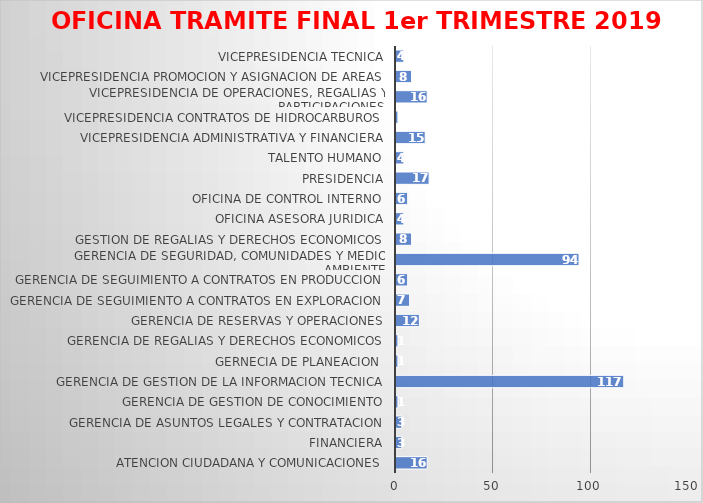
| Category | Series 0 |
|---|---|
| ATENCION CIUDADANA Y COMUNICACIONES | 16 |
| FINANCIERA | 3 |
| GERENCIA DE ASUNTOS LEGALES Y CONTRATACION | 3 |
| GERENCIA DE GESTION DE CONOCIMIENTO | 1 |
| GERENCIA DE GESTION DE LA INFORMACION TECNICA | 117 |
| GERNECIA DE PLANEACION  | 1 |
| GERENCIA DE REGALIAS Y DERECHOS ECONOMICOS | 1 |
| GERENCIA DE RESERVAS Y OPERACIONES | 12 |
| GERENCIA DE SEGUIMIENTO A CONTRATOS EN EXPLORACION | 7 |
| GERENCIA DE SEGUIMIENTO A CONTRATOS EN PRODUCCION | 6 |
| GERENCIA DE SEGURIDAD, COMUNIDADES Y MEDIO AMBIENTE | 94 |
| GESTION DE REGALIAS Y DERECHOS ECONOMICOS | 8 |
| OFICINA ASESORA JURIDICA | 4 |
| OFICINA DE CONTROL INTERNO | 6 |
| PRESIDENCIA | 17 |
| TALENTO HUMANO | 4 |
| VICEPRESIDENCIA ADMINISTRATIVA Y FINANCIERA | 15 |
| VICEPRESIDENCIA CONTRATOS DE HIDROCARBUROS | 1 |
| VICEPRESIDENCIA DE OPERACIONES, REGALIAS Y PARTICIPACIONES | 16 |
| VICEPRESIDENCIA PROMOCION Y ASIGNACION DE AREAS | 8 |
| VICEPRESIDENCIA TECNICA | 4 |